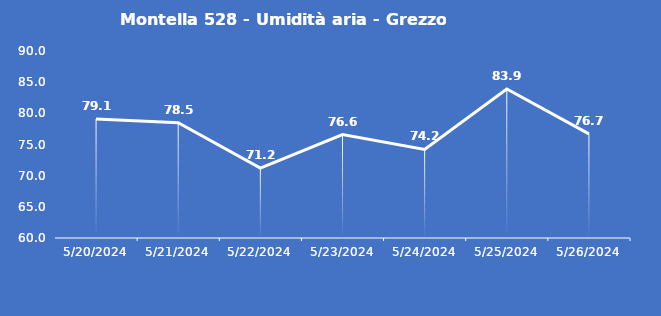
| Category | Montella 528 - Umidità aria - Grezzo (%) |
|---|---|
| 5/20/24 | 79.1 |
| 5/21/24 | 78.5 |
| 5/22/24 | 71.2 |
| 5/23/24 | 76.6 |
| 5/24/24 | 74.2 |
| 5/25/24 | 83.9 |
| 5/26/24 | 76.7 |